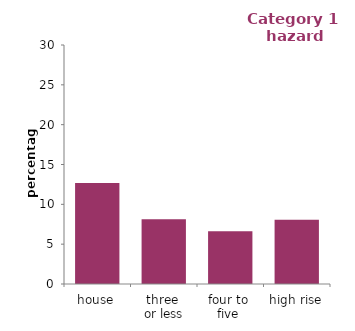
| Category | Category 1 
hazard |
|---|---|
| house | 12.664 |
| three 
or less | 8.139 |
| four to 
five  | 6.61 |
| high rise | 8.077 |